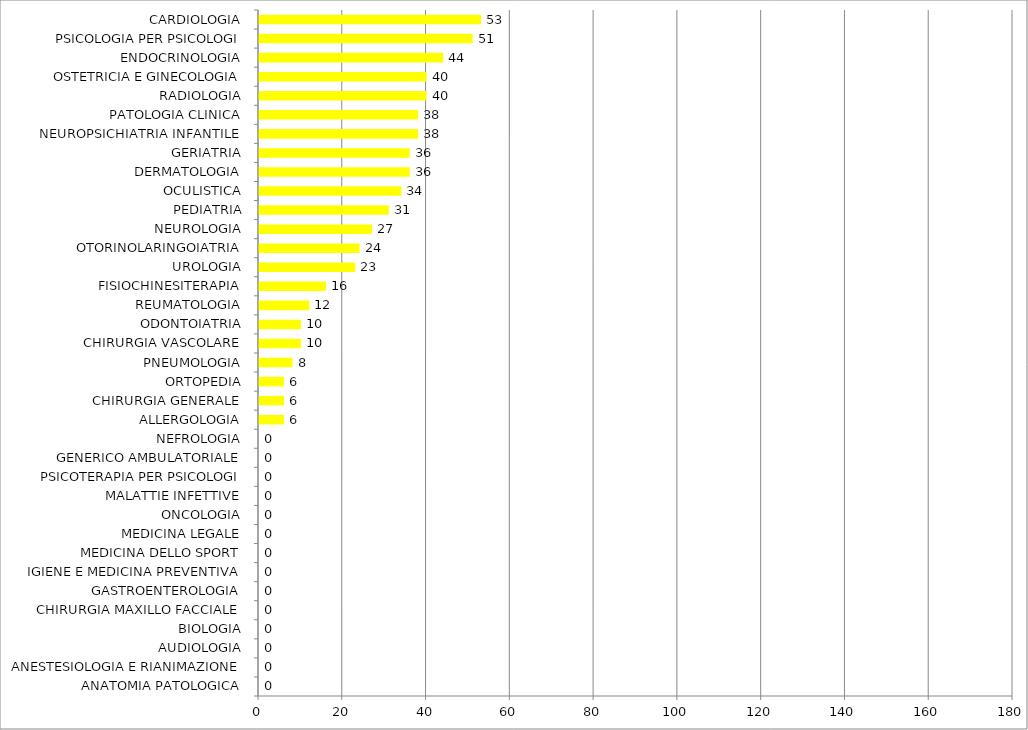
| Category | Series 0 |
|---|---|
| ANATOMIA PATOLOGICA | 0 |
| ANESTESIOLOGIA E RIANIMAZIONE | 0 |
| AUDIOLOGIA | 0 |
| BIOLOGIA | 0 |
| CHIRURGIA MAXILLO FACCIALE | 0 |
| GASTROENTEROLOGIA | 0 |
| IGIENE E MEDICINA PREVENTIVA | 0 |
| MEDICINA DELLO SPORT | 0 |
| MEDICINA LEGALE | 0 |
| ONCOLOGIA | 0 |
| MALATTIE INFETTIVE | 0 |
| PSICOTERAPIA PER PSICOLOGI | 0 |
| GENERICO AMBULATORIALE | 0 |
| NEFROLOGIA | 0 |
| ALLERGOLOGIA | 6 |
| CHIRURGIA GENERALE | 6 |
| ORTOPEDIA | 6 |
| PNEUMOLOGIA | 8 |
| CHIRURGIA VASCOLARE | 10 |
| ODONTOIATRIA | 10 |
| REUMATOLOGIA | 12 |
| FISIOCHINESITERAPIA | 16 |
| UROLOGIA | 23 |
| OTORINOLARINGOIATRIA | 24 |
| NEUROLOGIA | 27 |
| PEDIATRIA | 31 |
| OCULISTICA | 34 |
| DERMATOLOGIA | 36 |
| GERIATRIA | 36 |
| NEUROPSICHIATRIA INFANTILE | 38 |
| PATOLOGIA CLINICA | 38 |
| RADIOLOGIA | 40 |
| OSTETRICIA E GINECOLOGIA | 40 |
| ENDOCRINOLOGIA | 44 |
| PSICOLOGIA PER PSICOLOGI | 51 |
| CARDIOLOGIA | 53 |